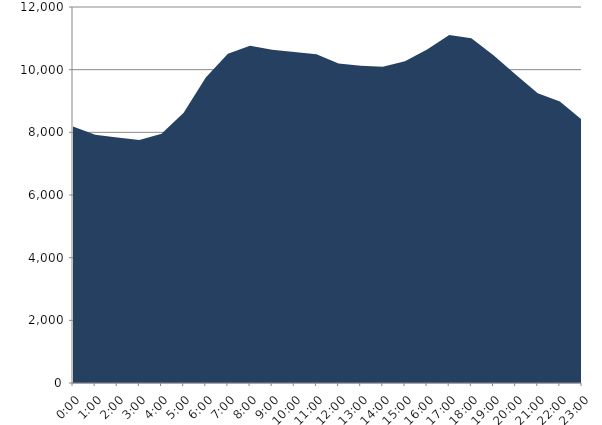
| Category | Series 0 | Series 1 |
|---|---|---|
| 2017-11-15 |  | 8185.27 |
| 2017-11-15 01:00:00 |  | 7923.13 |
| 2017-11-15 02:00:00 |  | 7835.72 |
| 2017-11-15 03:00:00 |  | 7755.12 |
| 2017-11-15 04:00:00 |  | 7958.75 |
| 2017-11-15 05:00:00 |  | 8621.19 |
| 2017-11-15 06:00:00 |  | 9747.19 |
| 2017-11-15 07:00:00 |  | 10511.67 |
| 2017-11-15 08:00:00 |  | 10765.89 |
| 2017-11-15 09:00:00 |  | 10636.15 |
| 2017-11-15 10:00:00 |  | 10567.61 |
| 2017-11-15 11:00:00 |  | 10493.61 |
| 2017-11-15 12:00:00 |  | 10200.04 |
| 2017-11-15 13:00:00 |  | 10121.9 |
| 2017-11-15 14:00:00 |  | 10094.68 |
| 2017-11-15 15:00:00 |  | 10271.61 |
| 2017-11-15 16:00:00 |  | 10644.09 |
| 2017-11-15 17:00:00 |  | 11108.07 |
| 2017-11-15 18:00:00 |  | 11003.57 |
| 2017-11-15 19:00:00 |  | 10459.6 |
| 2017-11-15 20:00:00 |  | 9848.91 |
| 2017-11-15 21:00:00 |  | 9244.84 |
| 2017-11-15 22:00:00 |  | 8983.29 |
| 2017-11-15 23:00:00 |  | 8395.13 |